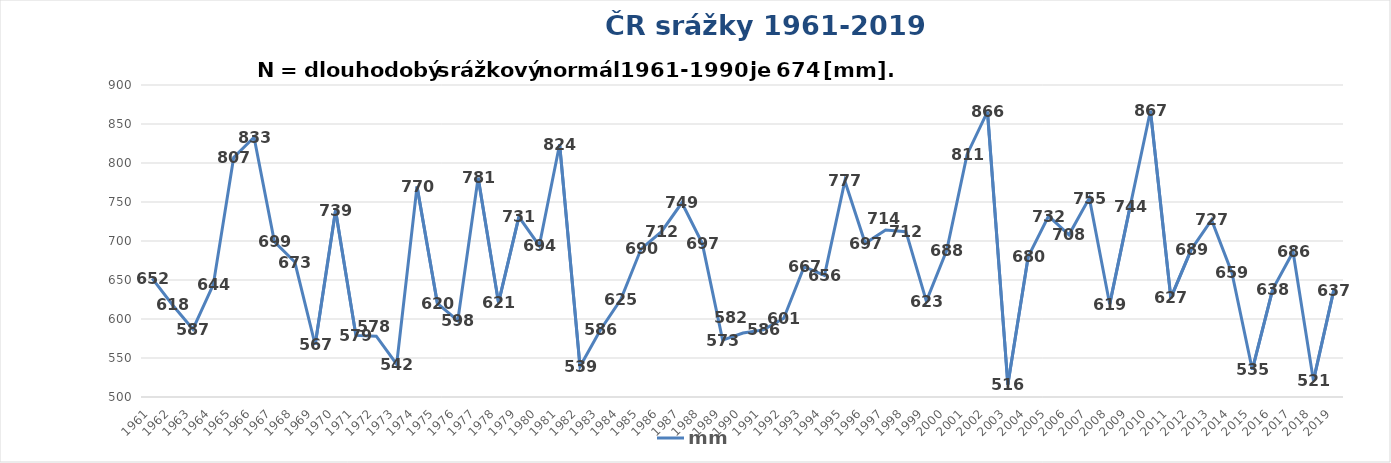
| Category | mm |
|---|---|
| 1961.0 | 652 |
| 1962.0 | 618 |
| 1963.0 | 587 |
| 1964.0 | 644 |
| 1965.0 | 807 |
| 1966.0 | 833 |
| 1967.0 | 699 |
| 1968.0 | 673 |
| 1969.0 | 567 |
| 1970.0 | 739 |
| 1971.0 | 579 |
| 1972.0 | 578 |
| 1973.0 | 542 |
| 1974.0 | 770 |
| 1975.0 | 620 |
| 1976.0 | 598 |
| 1977.0 | 781 |
| 1978.0 | 621 |
| 1979.0 | 731 |
| 1980.0 | 694 |
| 1981.0 | 824 |
| 1982.0 | 539 |
| 1983.0 | 586 |
| 1984.0 | 625 |
| 1985.0 | 690 |
| 1986.0 | 712 |
| 1987.0 | 749 |
| 1988.0 | 697 |
| 1989.0 | 573 |
| 1990.0 | 582 |
| 1991.0 | 586 |
| 1992.0 | 601 |
| 1993.0 | 667 |
| 1994.0 | 656 |
| 1995.0 | 777 |
| 1996.0 | 697 |
| 1997.0 | 714 |
| 1998.0 | 712 |
| 1999.0 | 623 |
| 2000.0 | 688 |
| 2001.0 | 811 |
| 2002.0 | 866 |
| 2003.0 | 516 |
| 2004.0 | 680 |
| 2005.0 | 732 |
| 2006.0 | 708 |
| 2007.0 | 755 |
| 2008.0 | 619 |
| 2009.0 | 744 |
| 2010.0 | 867 |
| 2011.0 | 627 |
| 2012.0 | 689 |
| 2013.0 | 727 |
| 2014.0 | 659 |
| 2015.0 | 535 |
| 2016.0 | 638 |
| 2017.0 | 686 |
| 2018.0 | 521 |
| 2019.0 | 637 |